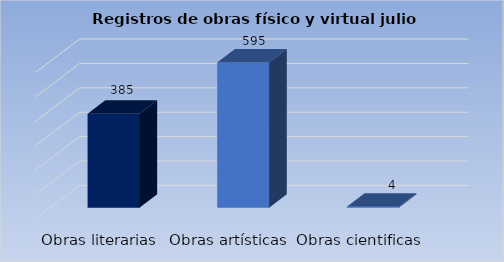
| Category | Cantidad |
|---|---|
| Obras literarias | 385 |
| Obras artísticas | 595 |
| Obras cientificas | 4 |